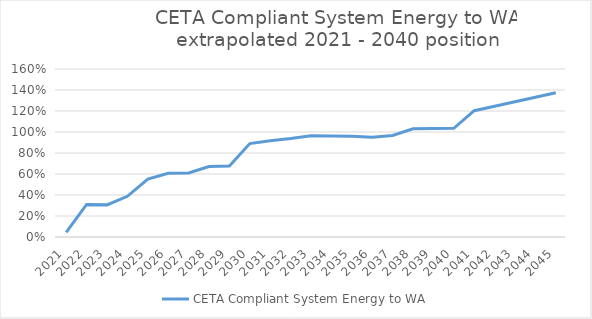
| Category | CETA Compliant System Energy to WA |
|---|---|
| 2021.0 | 0.044 |
| 2022.0 | 0.31 |
| 2023.0 | 0.306 |
| 2024.0 | 0.388 |
| 2025.0 | 0.551 |
| 2026.0 | 0.607 |
| 2027.0 | 0.61 |
| 2028.0 | 0.672 |
| 2029.0 | 0.676 |
| 2030.0 | 0.889 |
| 2031.0 | 0.917 |
| 2032.0 | 0.939 |
| 2033.0 | 0.964 |
| 2034.0 | 0.962 |
| 2035.0 | 0.959 |
| 2036.0 | 0.95 |
| 2037.0 | 0.967 |
| 2038.0 | 1.031 |
| 2039.0 | 1.033 |
| 2040.0 | 1.035 |
| 2041.0 | 1.203 |
| 2042.0 | 1.245 |
| 2043.0 | 1.288 |
| 2044.0 | 1.331 |
| 2045.0 | 1.374 |